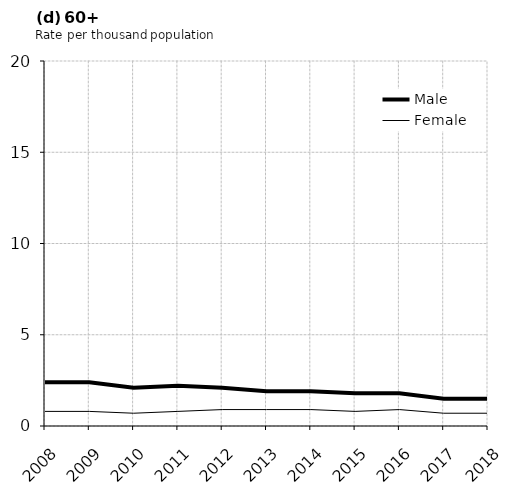
| Category | Male | Female |
|---|---|---|
| 2008.0 | 2.4 | 0.8 |
| 2009.0 | 2.4 | 0.8 |
| 2010.0 | 2.1 | 0.7 |
| 2011.0 | 2.2 | 0.8 |
| 2012.0 | 2.1 | 0.9 |
| 2013.0 | 1.9 | 0.9 |
| 2014.0 | 1.9 | 0.9 |
| 2015.0 | 1.8 | 0.8 |
| 2016.0 | 1.8 | 0.9 |
| 2017.0 | 1.5 | 0.7 |
| 2018.0 | 1.5 | 0.7 |